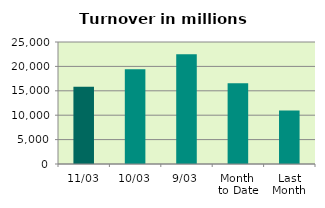
| Category | Series 0 |
|---|---|
| 11/03 | 15846.898 |
| 10/03 | 19404.912 |
| 9/03 | 22473.7 |
| Month 
to Date | 16567.789 |
| Last
Month | 10948.033 |